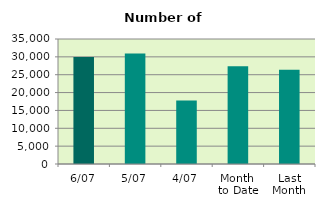
| Category | Series 0 |
|---|---|
| 6/07 | 29994 |
| 5/07 | 30918 |
| 4/07 | 17774 |
| Month 
to Date | 27342 |
| Last
Month | 26399.455 |